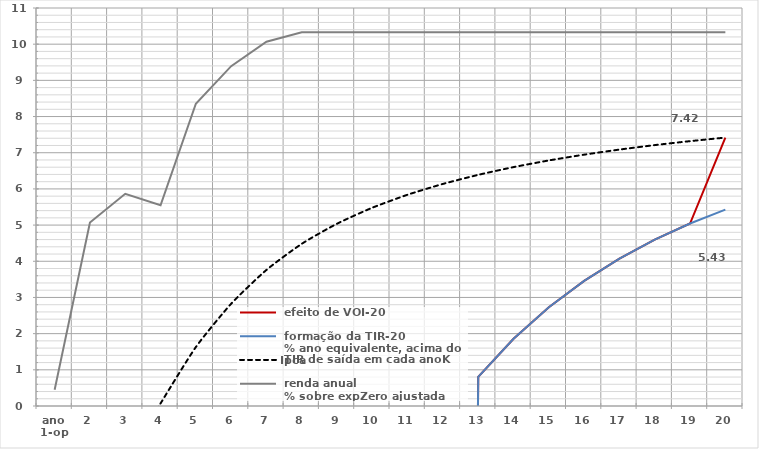
| Category |  efeito de VOI-20 |  formação da TIR-20
 % ano equivalente, acima do Ipca |  TIR de saída em cada anoK |  renda anual
 % sobre expZero ajustada |
|---|---|---|---|---|
| ano
1-op | -100 | -100 | -13.837 | 0.45 |
| 2 | -100 | -100 | -4.914 | 5.073 |
| 3 | -100 | -100 | -1.552 | 5.865 |
| 4 | -100 | -100 | 0.071 | 5.548 |
| 5 | -100 | -100 | 1.629 | 8.353 |
| 6 | -100 | -100 | 2.826 | 9.392 |
| 7 | -100 | -100 | 3.761 | 10.067 |
| 8 | -100 | -100 | 4.483 | 10.327 |
| 9 | -100 | -100 | 5.039 | 10.327 |
| 10 | -100 | -100 | 5.481 | 10.327 |
| 11 | -100 | -100 | 5.84 | 10.327 |
| 12 | -100 | -100 | 6.138 | 10.327 |
| 13 | 0.805 | 0.805 | 6.389 | 10.327 |
| 14 | 1.857 | 1.857 | 6.602 | 10.327 |
| 15 | 2.729 | 2.729 | 6.787 | 10.327 |
| 16 | 3.458 | 3.458 | 6.947 | 10.327 |
| 17 | 4.074 | 4.074 | 7.087 | 10.327 |
| 18 | 4.596 | 4.596 | 7.211 | 10.327 |
| 19 | 5.044 | 5.044 | 7.32 | 10.327 |
| 20 | 7.418 | 5.429 | 7.418 | 10.327 |